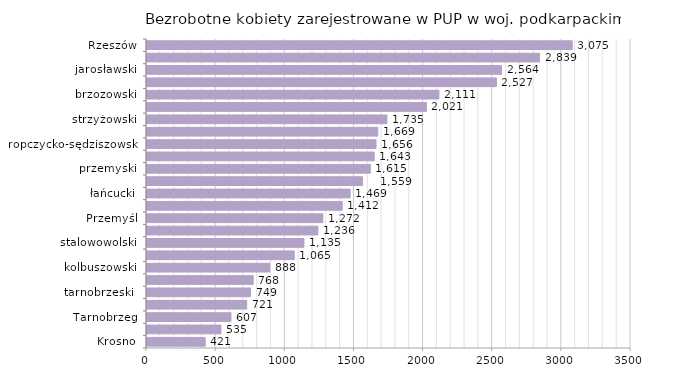
| Category | Bezrobotne kobiety zarejestrowane w PUP w woj. podkarpackim |
|---|---|
| Krosno | 421 |
| bieszczadzki | 535 |
| Tarnobrzeg | 607 |
| leski | 721 |
| tarnobrzeski  | 749 |
| lubaczowski | 768 |
| kolbuszowski | 888 |
| krośnieński | 1065 |
| stalowowolski | 1135 |
| sanocki | 1236 |
| Przemyśl | 1272 |
| mielecki | 1412 |
| łańcucki | 1469 |
| dębicki | 1559 |
| przemyski | 1615 |
| leżajski | 1643 |
| ropczycko-sędziszowski | 1656 |
| niżański | 1669 |
| strzyżowski | 1735 |
| przeworski | 2021 |
| brzozowski | 2111 |
| rzeszowski | 2527 |
| jarosławski | 2564 |
| jasielski | 2839 |
| Rzeszów | 3075 |